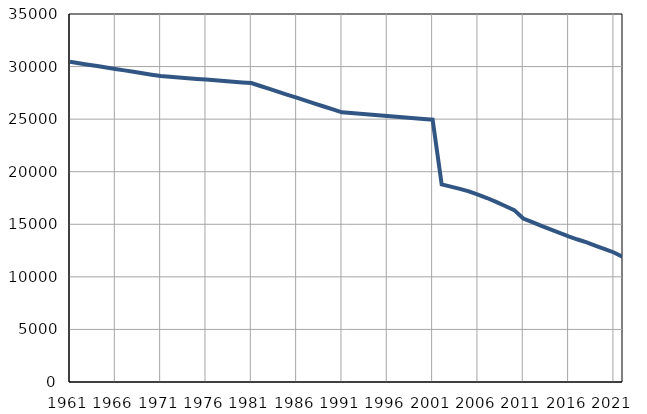
| Category | Број
становника |
|---|---|
| 1961.0 | 30452 |
| 1962.0 | 30316 |
| 1963.0 | 30181 |
| 1964.0 | 30045 |
| 1965.0 | 29909 |
| 1966.0 | 29774 |
| 1967.0 | 29638 |
| 1968.0 | 29502 |
| 1969.0 | 29366 |
| 1970.0 | 29230 |
| 1971.0 | 29095 |
| 1972.0 | 29028 |
| 1973.0 | 28962 |
| 1974.0 | 28895 |
| 1975.0 | 28829 |
| 1976.0 | 28762 |
| 1977.0 | 28695 |
| 1978.0 | 28629 |
| 1979.0 | 28562 |
| 1980.0 | 28496 |
| 1981.0 | 28429 |
| 1982.0 | 28151 |
| 1983.0 | 27873 |
| 1984.0 | 27594 |
| 1985.0 | 27317 |
| 1986.0 | 27038 |
| 1987.0 | 26761 |
| 1988.0 | 26483 |
| 1989.0 | 26205 |
| 1990.0 | 25927 |
| 1991.0 | 25649 |
| 1992.0 | 25579 |
| 1993.0 | 25508 |
| 1994.0 | 25438 |
| 1995.0 | 25368 |
| 1996.0 | 25298 |
| 1997.0 | 25226 |
| 1998.0 | 25157 |
| 1999.0 | 25087 |
| 2000.0 | 25017 |
| 2001.0 | 24946 |
| 2002.0 | 18792 |
| 2003.0 | 18583 |
| 2004.0 | 18373 |
| 2005.0 | 18127 |
| 2006.0 | 17825 |
| 2007.0 | 17497 |
| 2008.0 | 17133 |
| 2009.0 | 16738 |
| 2010.0 | 16346 |
| 2011.0 | 15548 |
| 2012.0 | 15201 |
| 2013.0 | 14852 |
| 2014.0 | 14515 |
| 2015.0 | 14192 |
| 2016.0 | 13851 |
| 2017.0 | 13551 |
| 2018.0 | 13273 |
| 2019.0 | 12954 |
| 2020.0 | 12641 |
| 2021.0 | 12317 |
| 2022.0 | 11885 |